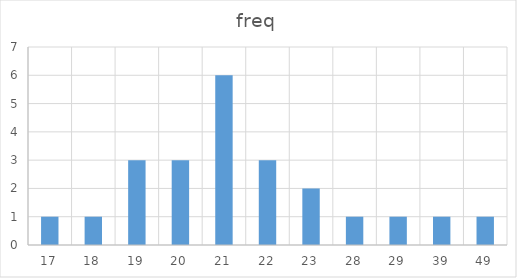
| Category | freq |
|---|---|
| 17.0 | 1 |
| 18.0 | 1 |
| 19.0 | 3 |
| 20.0 | 3 |
| 21.0 | 6 |
| 22.0 | 3 |
| 23.0 | 2 |
| 28.0 | 1 |
| 29.0 | 1 |
| 39.0 | 1 |
| 49.0 | 1 |